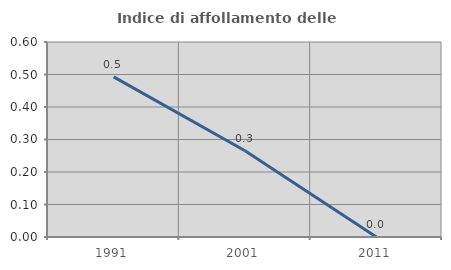
| Category | Indice di affollamento delle abitazioni  |
|---|---|
| 1991.0 | 0.493 |
| 2001.0 | 0.265 |
| 2011.0 | 0 |